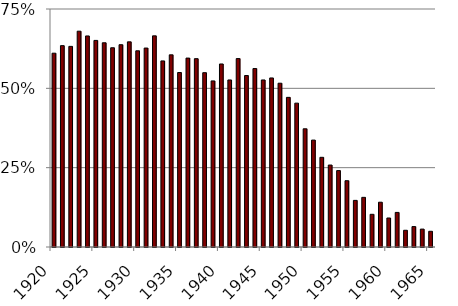
| Category | Share with a DB plan |
|---|---|
| 1920.0 | 0.611 |
| 1921.0 | 0.635 |
| 1922.0 | 0.632 |
| 1923.0 | 0.68 |
| 1924.0 | 0.665 |
| 1925.0 | 0.651 |
| 1926.0 | 0.644 |
| 1927.0 | 0.628 |
| 1928.0 | 0.637 |
| 1929.0 | 0.646 |
| 1930.0 | 0.618 |
| 1931.0 | 0.627 |
| 1932.0 | 0.665 |
| 1933.0 | 0.586 |
| 1934.0 | 0.606 |
| 1935.0 | 0.55 |
| 1936.0 | 0.595 |
| 1937.0 | 0.594 |
| 1938.0 | 0.549 |
| 1939.0 | 0.523 |
| 1940.0 | 0.577 |
| 1941.0 | 0.526 |
| 1942.0 | 0.594 |
| 1943.0 | 0.54 |
| 1944.0 | 0.562 |
| 1945.0 | 0.526 |
| 1946.0 | 0.533 |
| 1947.0 | 0.516 |
| 1948.0 | 0.472 |
| 1949.0 | 0.453 |
| 1950.0 | 0.373 |
| 1951.0 | 0.337 |
| 1952.0 | 0.283 |
| 1953.0 | 0.258 |
| 1954.0 | 0.241 |
| 1955.0 | 0.209 |
| 1956.0 | 0.147 |
| 1957.0 | 0.156 |
| 1958.0 | 0.103 |
| 1959.0 | 0.141 |
| 1960.0 | 0.091 |
| 1961.0 | 0.109 |
| 1962.0 | 0.053 |
| 1963.0 | 0.064 |
| 1964.0 | 0.056 |
| 1965.0 | 0.049 |